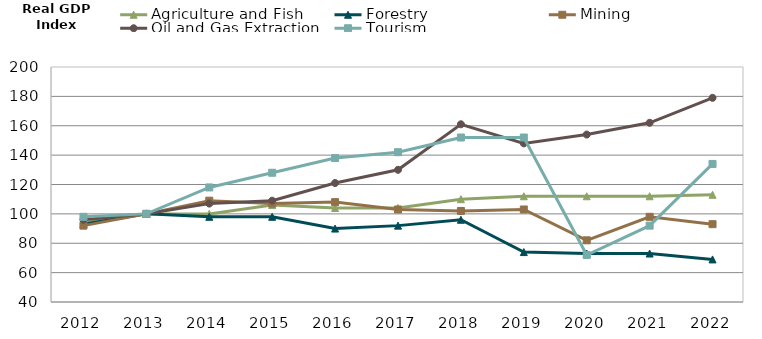
| Category | Agriculture and Fish | Forestry | Mining | Oil and Gas Extraction | Tourism |
|---|---|---|---|---|---|
| 2012.0 | 94 | 93 | 92 | 96 | 98 |
| 2013.0 | 100 | 100 | 100 | 100 | 100 |
| 2014.0 | 100 | 98 | 109 | 107 | 118 |
| 2015.0 | 106 | 98 | 107 | 109 | 128 |
| 2016.0 | 104 | 90 | 108 | 121 | 138 |
| 2017.0 | 104 | 92 | 103 | 130 | 142 |
| 2018.0 | 110 | 96 | 102 | 161 | 152 |
| 2019.0 | 112 | 74 | 103 | 148 | 152 |
| 2020.0 | 112 | 73 | 82 | 154 | 72 |
| 2021.0 | 112 | 73 | 98 | 162 | 92 |
| 2022.0 | 113 | 69 | 93 | 179 | 134 |